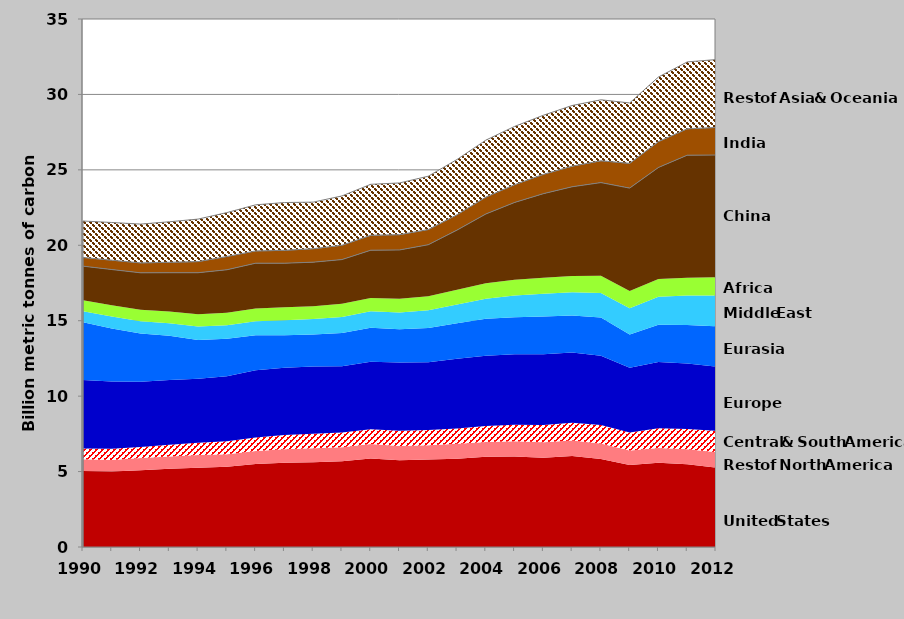
| Category | United States | Rest of North America | Central & South America | Europe | Eurasia | Middle East | Africa | China | India | Rest of Asia & Oceania |
|---|---|---|---|---|---|---|---|---|---|---|
| 1990.0 | 5040.77 | 773.663 | 716.324 | 4542.926 | 3817.584 | 729.887 | 727.406 | 2268.89 | 578.619 | 2414.315 |
| 1991.0 | 4997.689 | 776.39 | 738.432 | 4452.253 | 3521.388 | 785.301 | 751.14 | 2369.339 | 620.848 | 2498.242 |
| 1992.0 | 5093.337 | 799.508 | 743.588 | 4315.958 | 3195.579 | 815.023 | 764.304 | 2448.881 | 659.876 | 2568.142 |
| 1993.0 | 5188.397 | 803.454 | 783.852 | 4300.178 | 2923.334 | 840.489 | 775.998 | 2565.387 | 691.447 | 2685.827 |
| 1994.0 | 5261.429 | 832.882 | 812.026 | 4242.329 | 2581.067 | 884.961 | 812.612 | 2754.009 | 740.707 | 2815.141 |
| 1995.0 | 5319.154 | 831.228 | 857.605 | 4312.516 | 2478.194 | 901.43 | 826.276 | 2851.777 | 879.55 | 2908.988 |
| 1996.0 | 5504.86 | 853.784 | 903.16 | 4451.473 | 2315.021 | 934.73 | 843.393 | 3005.782 | 814.411 | 3054.205 |
| 1997.0 | 5577.387 | 895.432 | 949.122 | 4461.186 | 2152.47 | 988.909 | 867.708 | 2918.217 | 856.001 | 3166.692 |
| 1998.0 | 5617.027 | 921.748 | 974.516 | 4449.81 | 2125.315 | 1019.484 | 856.423 | 2916.263 | 893.428 | 3086.276 |
| 1999.0 | 5678.32 | 930.907 | 978.439 | 4395.59 | 2206.836 | 1057.077 | 872.976 | 2932.723 | 951.317 | 3267.584 |
| 2000.0 | 5863.755 | 957.329 | 991.976 | 4459.473 | 2252.954 | 1094.771 | 887.08 | 3165.32 | 990.975 | 3377.414 |
| 2001.0 | 5754.546 | 942.599 | 1014.043 | 4513.07 | 2203.538 | 1119.883 | 915.627 | 3226.522 | 1016.322 | 3426.081 |
| 2002.0 | 5798.652 | 947.815 | 1004.798 | 4493.078 | 2274.962 | 1177.48 | 917.757 | 3422.086 | 1007.588 | 3535.102 |
| 2003.0 | 5852.684 | 986.188 | 1021.092 | 4613.073 | 2360.761 | 1243.517 | 968.24 | 3959.966 | 1022.436 | 3660.401 |
| 2004.0 | 5974.384 | 990.877 | 1062.431 | 4657.645 | 2440.206 | 1334.837 | 1016.334 | 4596.97 | 1121.108 | 3774.884 |
| 2005.0 | 5999.142 | 1008.734 | 1103.419 | 4659.185 | 2451.209 | 1447.737 | 1052.752 | 5116.349 | 1181.398 | 3860.298 |
| 2006.0 | 5923.588 | 1016.973 | 1148.993 | 4694.949 | 2501.438 | 1502.528 | 1058.645 | 5575.198 | 1280.6 | 3916.697 |
| 2007.0 | 6024.107 | 1035.273 | 1168.953 | 4657.089 | 2467.665 | 1531.168 | 1087.427 | 5908.428 | 1366.014 | 4020.775 |
| 2008.0 | 5840.549 | 1028.52 | 1220.357 | 4581.15 | 2534.584 | 1630.848 | 1152.383 | 6166.566 | 1448.991 | 4040.654 |
| 2009.0 | 5429.795 | 967.462 | 1197.999 | 4279.517 | 2211.981 | 1740.677 | 1145.849 | 6816.095 | 1642.933 | 4003.311 |
| 2010.0 | 5580.015 | 983.754 | 1310.844 | 4386.991 | 2466.168 | 1863.308 | 1179.972 | 7388.502 | 1714.907 | 4280.374 |
| 2011.0 | 5483.212 | 999.114 | 1335.237 | 4348.063 | 2551.37 | 1959.433 | 1168.656 | 8126.694 | 1752.675 | 4430.535 |
| 2012.0 | 5270.422 | 1027.884 | 1399.618 | 4263.257 | 2671.979 | 2035.652 | 1205.703 | 8106.43 | 1830.938 | 4498.402 |